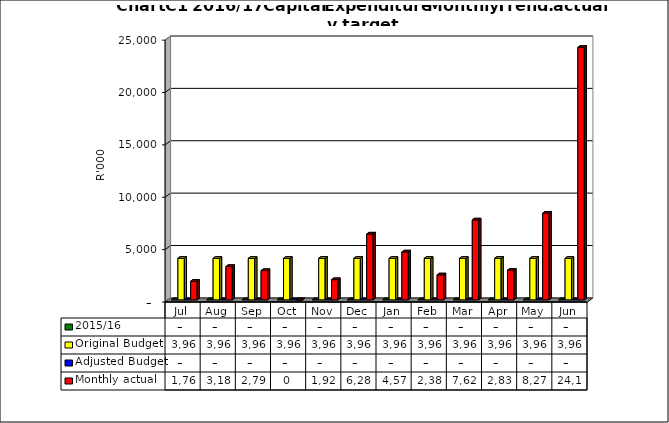
| Category | 2015/16 | Original Budget | Adjusted Budget | Monthly actual |
|---|---|---|---|---|
| Jul | 0 | 3960831.417 | 0 | 1768200 |
| Aug | 0 | 3960831.417 | 0 | 3180248 |
| Sep | 0 | 3960831.417 | 0 | 2796618 |
| Oct | 0 | 3960831.417 | 0 | 1 |
| Nov | 0 | 3960831.417 | 0 | 1928709 |
| Dec | 0 | 3960831.417 | 0 | 6280575 |
| Jan | 0 | 3960831.417 | 0 | 4570525.2 |
| Feb | 0 | 3960831.417 | 0 | 2380767.38 |
| Mar | 0 | 3960831.417 | 0 | 7626867.23 |
| Apr | 0 | 3960831.417 | 0 | 2829572 |
| May | 0 | 3960831.417 | 0 | 8275353 |
| Jun | 0 | 3960831.417 | 0 | 24099751 |